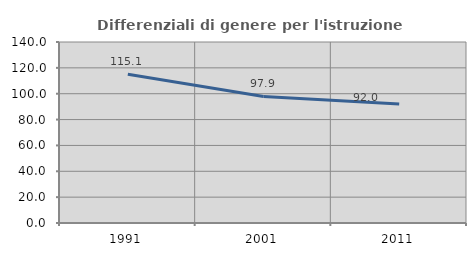
| Category | Differenziali di genere per l'istruzione superiore |
|---|---|
| 1991.0 | 115.115 |
| 2001.0 | 97.899 |
| 2011.0 | 91.999 |